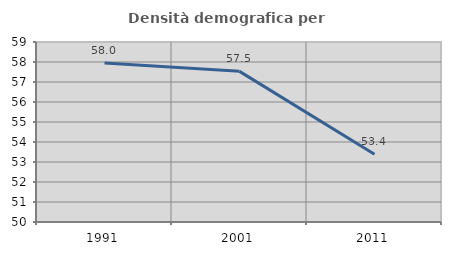
| Category | Densità demografica |
|---|---|
| 1991.0 | 57.956 |
| 2001.0 | 57.533 |
| 2011.0 | 53.387 |